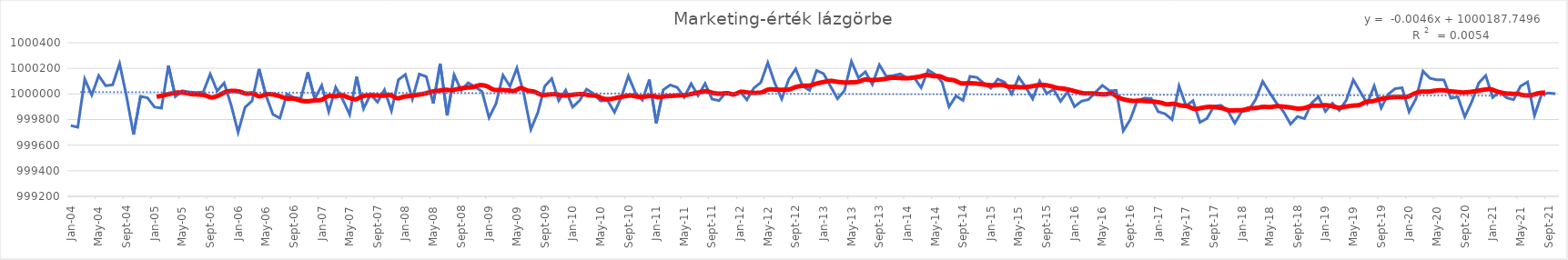
| Category | Becslés |
|---|---|
| 2004-01-01 | 999752.7 |
| 2004-02-01 | 999740.2 |
| 2004-03-01 | 1000116.2 |
| 2004-04-01 | 999991.2 |
| 2004-05-01 | 1000143.2 |
| 2004-06-01 | 1000064.2 |
| 2004-07-01 | 1000071.2 |
| 2004-08-01 | 1000236.7 |
| 2004-09-01 | 999978.7 |
| 2004-10-01 | 999682.7 |
| 2004-11-01 | 999981.7 |
| 2004-12-01 | 999970.2 |
| 2005-01-01 | 999898.2 |
| 2005-02-01 | 999888.2 |
| 2005-03-01 | 1000221.7 |
| 2005-04-01 | 999979.2 |
| 2005-05-01 | 1000024.2 |
| 2005-06-01 | 1000015.2 |
| 2005-07-01 | 1000011.7 |
| 2005-08-01 | 1000015.2 |
| 2005-09-01 | 1000155.2 |
| 2005-10-01 | 1000023.2 |
| 2005-11-01 | 1000085.7 |
| 2005-12-01 | 999912.7 |
| 2006-01-01 | 999701.2 |
| 2006-02-01 | 999896.2 |
| 2006-03-01 | 999945.2 |
| 2006-04-01 | 1000195.7 |
| 2006-05-01 | 999988.7 |
| 2006-06-01 | 999839.7 |
| 2006-07-01 | 999811.7 |
| 2006-08-01 | 999999.2 |
| 2006-09-01 | 999972.2 |
| 2006-10-01 | 999965.2 |
| 2006-11-01 | 1000169.2 |
| 2006-12-01 | 999962.7 |
| 2007-01-01 | 1000066.7 |
| 2007-02-01 | 999861.2 |
| 2007-03-01 | 1000052.2 |
| 2007-04-01 | 999957.2 |
| 2007-05-01 | 999839.7 |
| 2007-06-01 | 1000135.2 |
| 2007-07-01 | 999885.2 |
| 2007-08-01 | 999996.2 |
| 2007-09-01 | 999936.2 |
| 2007-10-01 | 1000032.7 |
| 2007-11-01 | 999869.2 |
| 2007-12-01 | 1000110.7 |
| 2008-01-01 | 1000151.7 |
| 2008-02-01 | 999960.2 |
| 2008-03-01 | 1000155.2 |
| 2008-04-01 | 1000135.2 |
| 2008-05-01 | 999925.7 |
| 2008-06-01 | 1000237.2 |
| 2008-07-01 | 999831.7 |
| 2008-08-01 | 1000149.2 |
| 2008-09-01 | 1000027.2 |
| 2008-10-01 | 1000086.7 |
| 2008-11-01 | 1000055.2 |
| 2008-12-01 | 1000019.2 |
| 2009-01-01 | 999815.2 |
| 2009-02-01 | 999923.2 |
| 2009-03-01 | 1000146.2 |
| 2009-04-01 | 1000059.7 |
| 2009-05-01 | 1000202.2 |
| 2009-06-01 | 999998.7 |
| 2009-07-01 | 999723.2 |
| 2009-08-01 | 999853.7 |
| 2009-09-01 | 1000060.7 |
| 2009-10-01 | 1000119.2 |
| 2009-11-01 | 999947.2 |
| 2009-12-01 | 1000029.2 |
| 2010-01-01 | 999897.2 |
| 2010-02-01 | 999949.2 |
| 2010-03-01 | 1000037.2 |
| 2010-04-01 | 1000002.2 |
| 2010-05-01 | 999945.2 |
| 2010-06-01 | 999950.2 |
| 2010-07-01 | 999856.7 |
| 2010-08-01 | 999977.2 |
| 2010-09-01 | 1000140.2 |
| 2010-10-01 | 1000009.2 |
| 2010-11-01 | 999951.7 |
| 2010-12-01 | 1000112.2 |
| 2011-01-01 | 999770.7 |
| 2011-02-01 | 1000032.2 |
| 2011-03-01 | 1000070.2 |
| 2011-04-01 | 1000050.7 |
| 2011-05-01 | 999974.2 |
| 2011-06-01 | 1000080.2 |
| 2011-07-01 | 999986.7 |
| 2011-08-01 | 1000081.2 |
| 2011-09-01 | 999960.2 |
| 2011-10-01 | 999948.2 |
| 2011-11-01 | 1000011.2 |
| 2011-12-01 | 999989.2 |
| 2012-01-01 | 1000020.2 |
| 2012-02-01 | 999954.2 |
| 2012-03-01 | 1000045.7 |
| 2012-04-01 | 1000089.7 |
| 2012-05-01 | 1000244.2 |
| 2012-06-01 | 1000083.7 |
| 2012-07-01 | 999960.7 |
| 2012-08-01 | 1000113.7 |
| 2012-09-01 | 1000195.7 |
| 2012-10-01 | 1000060.7 |
| 2012-11-01 | 1000027.7 |
| 2012-12-01 | 1000183.2 |
| 2013-01-01 | 1000158.2 |
| 2013-02-01 | 1000059.2 |
| 2013-03-01 | 999962.7 |
| 2013-04-01 | 1000026.7 |
| 2013-05-01 | 1000253.7 |
| 2013-06-01 | 1000126.7 |
| 2013-07-01 | 1000172.7 |
| 2013-08-01 | 1000074.7 |
| 2013-09-01 | 1000227.7 |
| 2013-10-01 | 1000137.7 |
| 2013-11-01 | 1000143.7 |
| 2013-12-01 | 1000156.7 |
| 2014-01-01 | 1000123.7 |
| 2014-02-01 | 1000126.7 |
| 2014-03-01 | 1000048.7 |
| 2014-04-01 | 1000186.2 |
| 2014-05-01 | 1000153.7 |
| 2014-06-01 | 1000092.2 |
| 2014-07-01 | 999899.7 |
| 2014-08-01 | 999984.7 |
| 2014-09-01 | 999949.7 |
| 2014-10-01 | 1000137.2 |
| 2014-11-01 | 1000128.7 |
| 2014-12-01 | 1000082.7 |
| 2015-01-01 | 1000044.7 |
| 2015-02-01 | 1000115.7 |
| 2015-03-01 | 1000090.7 |
| 2015-04-01 | 1000000.7 |
| 2015-05-01 | 1000130.7 |
| 2015-06-01 | 1000053.7 |
| 2015-07-01 | 999961.2 |
| 2015-08-01 | 1000100.7 |
| 2015-09-01 | 1000002.7 |
| 2015-10-01 | 1000035.7 |
| 2015-11-01 | 999942.7 |
| 2015-12-01 | 1000015.7 |
| 2016-01-01 | 999901.2 |
| 2016-02-01 | 999943.2 |
| 2016-03-01 | 999956.2 |
| 2016-04-01 | 1000012.2 |
| 2016-05-01 | 1000067.2 |
| 2016-06-01 | 1000025.7 |
| 2016-07-01 | 1000026.7 |
| 2016-08-01 | 999711.7 |
| 2016-09-01 | 999799.2 |
| 2016-10-01 | 999947.7 |
| 2016-11-01 | 999966.2 |
| 2016-12-01 | 999965.7 |
| 2017-01-01 | 999861.7 |
| 2017-02-01 | 999844.7 |
| 2017-03-01 | 999799.7 |
| 2017-04-01 | 1000062.2 |
| 2017-05-01 | 999907.2 |
| 2017-06-01 | 999947.2 |
| 2017-07-01 | 999778.7 |
| 2017-08-01 | 999807.7 |
| 2017-09-01 | 999903.7 |
| 2017-10-01 | 999911.7 |
| 2017-11-01 | 999868.2 |
| 2017-12-01 | 999771.7 |
| 2018-01-01 | 999862.7 |
| 2018-02-01 | 999871.2 |
| 2018-03-01 | 999958.2 |
| 2018-04-01 | 1000097.7 |
| 2018-05-01 | 1000010.2 |
| 2018-06-01 | 999927.7 |
| 2018-07-01 | 999860.7 |
| 2018-08-01 | 999764.7 |
| 2018-09-01 | 999823.2 |
| 2018-10-01 | 999807.2 |
| 2018-11-01 | 999927.7 |
| 2018-12-01 | 999977.7 |
| 2019-01-01 | 999863.7 |
| 2019-02-01 | 999926.7 |
| 2019-03-01 | 999871.2 |
| 2019-04-01 | 999952.2 |
| 2019-05-01 | 1000109.7 |
| 2019-06-01 | 1000017.2 |
| 2019-07-01 | 999924.7 |
| 2019-08-01 | 1000062.7 |
| 2019-09-01 | 999890.7 |
| 2019-10-01 | 999997.2 |
| 2019-11-01 | 1000041.2 |
| 2019-12-01 | 1000048.2 |
| 2020-01-01 | 999860.7 |
| 2020-02-01 | 999963.7 |
| 2020-03-01 | 1000178.2 |
| 2020-04-01 | 1000122.2 |
| 2020-05-01 | 1000110.2 |
| 2020-06-01 | 1000109.7 |
| 2020-07-01 | 999966.7 |
| 2020-08-01 | 999976.7 |
| 2020-09-01 | 999821.7 |
| 2020-10-01 | 999939.2 |
| 2020-11-01 | 1000085.7 |
| 2020-12-01 | 1000143.7 |
| 2021-01-01 | 999972.7 |
| 2021-02-01 | 1000017.7 |
| 2021-03-01 | 999969.7 |
| 2021-04-01 | 999955.7 |
| 2021-05-01 | 1000060.7 |
| 2021-06-01 | 1000093.2 |
| 2021-07-01 | 999831.2 |
| 2021-08-01 | 999994.2 |
| 2021-09-01 | 1000007.2 |
| 2021-10-01 | 1000001.7 |